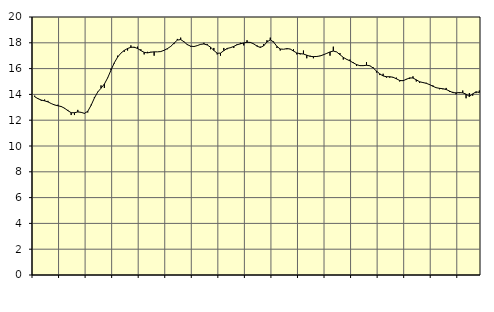
| Category | Piggar | Series 1 |
|---|---|---|
| nan | 13.9 | 13.82 |
| 87.0 | 13.7 | 13.67 |
| 87.0 | 13.5 | 13.56 |
| 87.0 | 13.6 | 13.5 |
| nan | 13.5 | 13.42 |
| 88.0 | 13.3 | 13.29 |
| 88.0 | 13.2 | 13.18 |
| 88.0 | 13.2 | 13.12 |
| nan | 13.1 | 13.06 |
| 89.0 | 12.9 | 12.93 |
| 89.0 | 12.8 | 12.74 |
| 89.0 | 12.4 | 12.58 |
| nan | 12.4 | 12.58 |
| 90.0 | 12.8 | 12.64 |
| 90.0 | 12.6 | 12.61 |
| 90.0 | 12.5 | 12.53 |
| nan | 12.6 | 12.69 |
| 91.0 | 13.2 | 13.15 |
| 91.0 | 13.8 | 13.72 |
| 91.0 | 14.2 | 14.18 |
| nan | 14.7 | 14.48 |
| 92.0 | 14.5 | 14.8 |
| 92.0 | 15.3 | 15.28 |
| 92.0 | 16 | 15.88 |
| nan | 16.4 | 16.45 |
| 93.0 | 17 | 16.89 |
| 93.0 | 17.2 | 17.2 |
| 93.0 | 17.3 | 17.41 |
| nan | 17.4 | 17.56 |
| 94.0 | 17.8 | 17.65 |
| 94.0 | 17.6 | 17.66 |
| 94.0 | 17.7 | 17.56 |
| nan | 17.5 | 17.4 |
| 95.0 | 17.1 | 17.26 |
| 95.0 | 17.3 | 17.22 |
| 95.0 | 17.3 | 17.27 |
| nan | 17 | 17.3 |
| 96.0 | 17.3 | 17.3 |
| 96.0 | 17.3 | 17.32 |
| 96.0 | 17.4 | 17.42 |
| nan | 17.5 | 17.55 |
| 97.0 | 17.7 | 17.72 |
| 97.0 | 17.9 | 17.97 |
| 97.0 | 18.3 | 18.21 |
| nan | 18.4 | 18.25 |
| 98.0 | 18.1 | 18.08 |
| 98.0 | 17.9 | 17.86 |
| 98.0 | 17.7 | 17.74 |
| nan | 17.7 | 17.71 |
| 99.0 | 17.8 | 17.78 |
| 99.0 | 17.9 | 17.88 |
| 99.0 | 18 | 17.91 |
| nan | 17.9 | 17.83 |
| 0.0 | 17.5 | 17.66 |
| 0.0 | 17.6 | 17.41 |
| 0.0 | 17.1 | 17.19 |
| nan | 17 | 17.2 |
| 1.0 | 17.6 | 17.39 |
| 1.0 | 17.5 | 17.56 |
| 1.0 | 17.6 | 17.62 |
| nan | 17.6 | 17.72 |
| 2.0 | 17.9 | 17.85 |
| 2.0 | 18 | 17.92 |
| 2.0 | 17.8 | 17.99 |
| nan | 18.2 | 18.04 |
| 3.0 | 18 | 18.03 |
| 3.0 | 17.9 | 17.92 |
| 3.0 | 17.8 | 17.74 |
| nan | 17.7 | 17.64 |
| 4.0 | 17.9 | 17.76 |
| 4.0 | 18.2 | 18.06 |
| 4.0 | 18.4 | 18.23 |
| nan | 18.1 | 18.06 |
| 5.0 | 17.6 | 17.72 |
| 5.0 | 17.4 | 17.52 |
| 5.0 | 17.5 | 17.5 |
| nan | 17.5 | 17.55 |
| 6.0 | 17.5 | 17.52 |
| 6.0 | 17.5 | 17.36 |
| 6.0 | 17.1 | 17.21 |
| nan | 17.1 | 17.16 |
| 7.0 | 17.4 | 17.13 |
| 7.0 | 16.8 | 17.04 |
| 7.0 | 17 | 16.95 |
| nan | 16.8 | 16.93 |
| 8.0 | 16.9 | 16.94 |
| 8.0 | 17 | 16.98 |
| 8.0 | 17.1 | 17.07 |
| nan | 17.2 | 17.18 |
| 9.0 | 17 | 17.29 |
| 9.0 | 17.7 | 17.36 |
| 9.0 | 17.3 | 17.29 |
| nan | 17.2 | 17.08 |
| 10.0 | 16.7 | 16.87 |
| 10.0 | 16.7 | 16.72 |
| 10.0 | 16.7 | 16.6 |
| nan | 16.5 | 16.45 |
| 11.0 | 16.2 | 16.31 |
| 11.0 | 16.2 | 16.23 |
| 11.0 | 16.2 | 16.23 |
| nan | 16.5 | 16.26 |
| 12.0 | 16.2 | 16.22 |
| 12.0 | 16.1 | 16.05 |
| 12.0 | 15.7 | 15.81 |
| nan | 15.5 | 15.59 |
| 13.0 | 15.6 | 15.43 |
| 13.0 | 15.3 | 15.37 |
| 13.0 | 15.3 | 15.37 |
| nan | 15.3 | 15.33 |
| 14.0 | 15.3 | 15.21 |
| 14.0 | 15 | 15.08 |
| 14.0 | 15.1 | 15.06 |
| nan | 15.2 | 15.17 |
| 15.0 | 15.2 | 15.28 |
| 15.0 | 15.4 | 15.27 |
| 15.0 | 15 | 15.13 |
| nan | 14.9 | 14.98 |
| 16.0 | 14.9 | 14.92 |
| 16.0 | 14.9 | 14.86 |
| 16.0 | 14.8 | 14.76 |
| nan | 14.7 | 14.63 |
| 17.0 | 14.5 | 14.52 |
| 17.0 | 14.4 | 14.47 |
| 17.0 | 14.4 | 14.44 |
| nan | 14.5 | 14.38 |
| 18.0 | 14.2 | 14.26 |
| 18.0 | 14.2 | 14.14 |
| 18.0 | 14 | 14.12 |
| nan | 14.1 | 14.14 |
| 19.0 | 14.3 | 14.12 |
| 19.0 | 13.7 | 14.02 |
| 19.0 | 14.1 | 13.84 |
| nan | 13.9 | 14.04 |
| 20.0 | 14.1 | 14.2 |
| 20.0 | 14.3 | 14.15 |